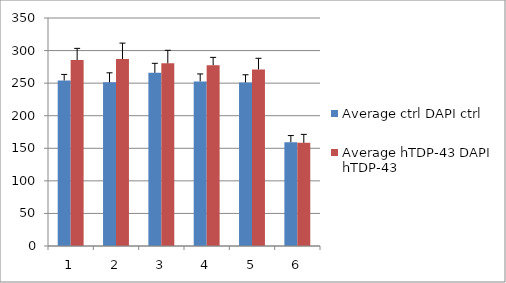
| Category | Average ctrl | Average hTDP-43 |
|---|---|---|
| 0 | 254.111 | 285.556 |
| 1 | 251.222 | 287 |
| 2 | 265.889 | 280.444 |
| 3 | 252.667 | 277.444 |
| 4 | 251 | 271.111 |
| 5 | 159.333 | 158.444 |